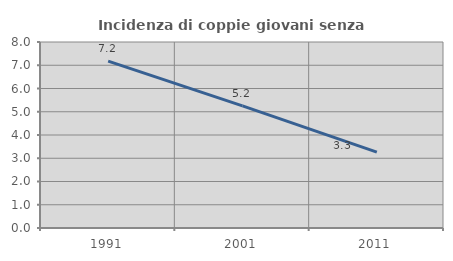
| Category | Incidenza di coppie giovani senza figli |
|---|---|
| 1991.0 | 7.177 |
| 2001.0 | 5.249 |
| 2011.0 | 3.264 |